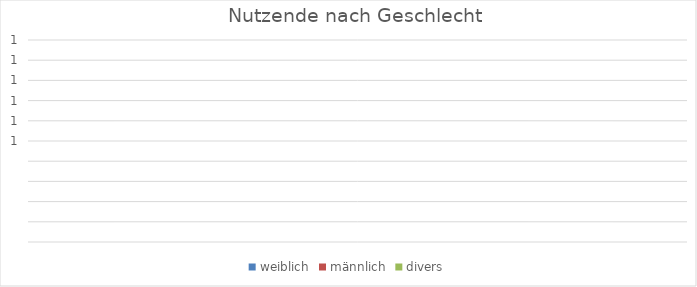
| Category | weiblich | männlich | divers |
|---|---|---|---|
| 0 | 0 | 0 | 0 |